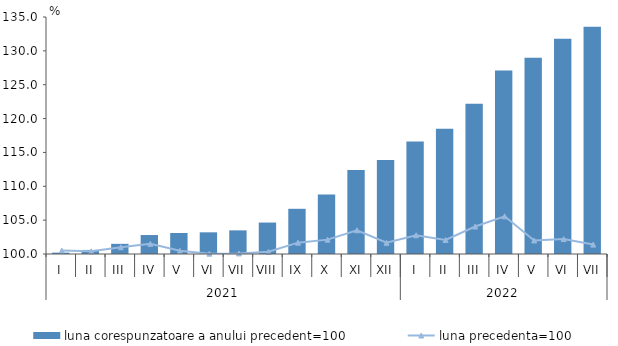
| Category | luna corespunzatoare a anului precedent=100 |
|---|---|
| 0 | 100.2 |
| 1 | 100.6 |
| 2 | 101.5 |
| 3 | 102.8 |
| 4 | 103.1 |
| 5 | 103.2 |
| 6 | 103.49 |
| 7 | 104.645 |
| 8 | 106.675 |
| 9 | 108.8 |
| 10 | 112.4 |
| 11 | 113.9 |
| 12 | 116.6 |
| 13 | 118.5 |
| 14 | 122.2 |
| 15 | 127.1 |
| 16 | 129 |
| 17 | 131.8 |
| 18 | 133.547 |